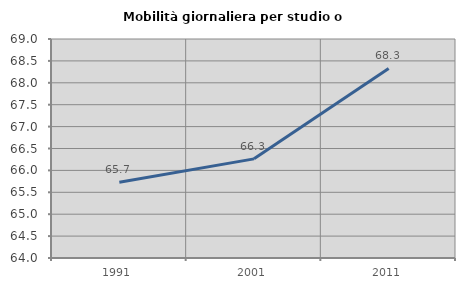
| Category | Mobilità giornaliera per studio o lavoro |
|---|---|
| 1991.0 | 65.732 |
| 2001.0 | 66.263 |
| 2011.0 | 68.328 |